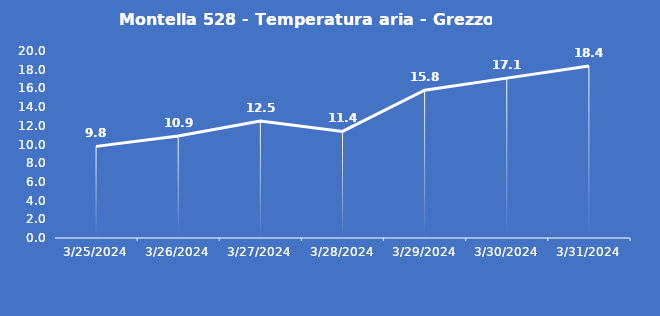
| Category | Montella 528 - Temperatura aria - Grezzo (°C) |
|---|---|
| 3/25/24 | 9.8 |
| 3/26/24 | 10.9 |
| 3/27/24 | 12.5 |
| 3/28/24 | 11.4 |
| 3/29/24 | 15.8 |
| 3/30/24 | 17.1 |
| 3/31/24 | 18.4 |